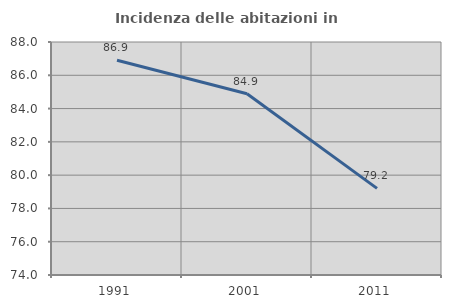
| Category | Incidenza delle abitazioni in proprietà  |
|---|---|
| 1991.0 | 86.9 |
| 2001.0 | 84.889 |
| 2011.0 | 79.206 |